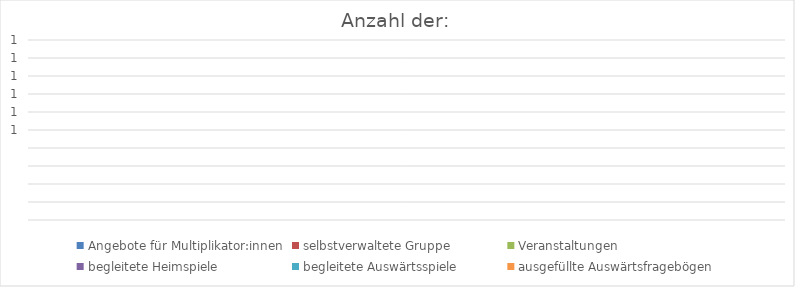
| Category | Angebote für Multiplikator:innen | selbstverwaltete Gruppe | Veranstaltungen | begleitete Heimspiele | begleitete Auswärtsspiele | ausgefüllte Auswärtsfragebögen |
|---|---|---|---|---|---|---|
| 0 | 0 | 0 | 0 | 0 | 0 | 0 |